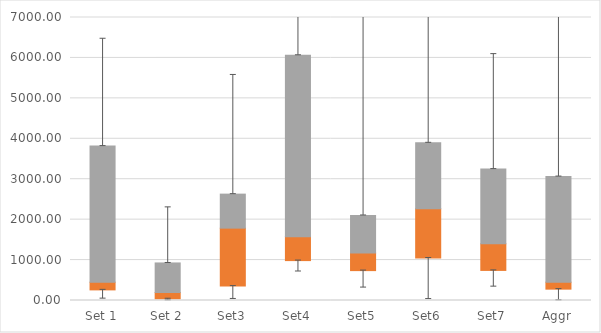
| Category | Q1 | Median-Q1 | Q3-Median |
|---|---|---|---|
| Set 1 | 262.42 | 191.104 | 3366.661 |
| Set 2 | 42.812 | 155.188 | 730.897 |
| Set3 | 356.171 | 1433.594 | 841.4 |
| Set4 | 986.992 | 592.001 | 4487.279 |
| Set5 | 739.29 | 432.614 | 932.33 |
| Set6 | 1049.658 | 1217.601 | 1634.071 |
| Set7 | 743.837 | 658.566 | 1848.836 |
| Aggr | 280.866 | 172.657 | 2613.06 |